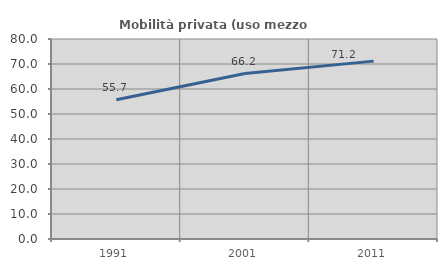
| Category | Mobilità privata (uso mezzo privato) |
|---|---|
| 1991.0 | 55.669 |
| 2001.0 | 66.169 |
| 2011.0 | 71.151 |